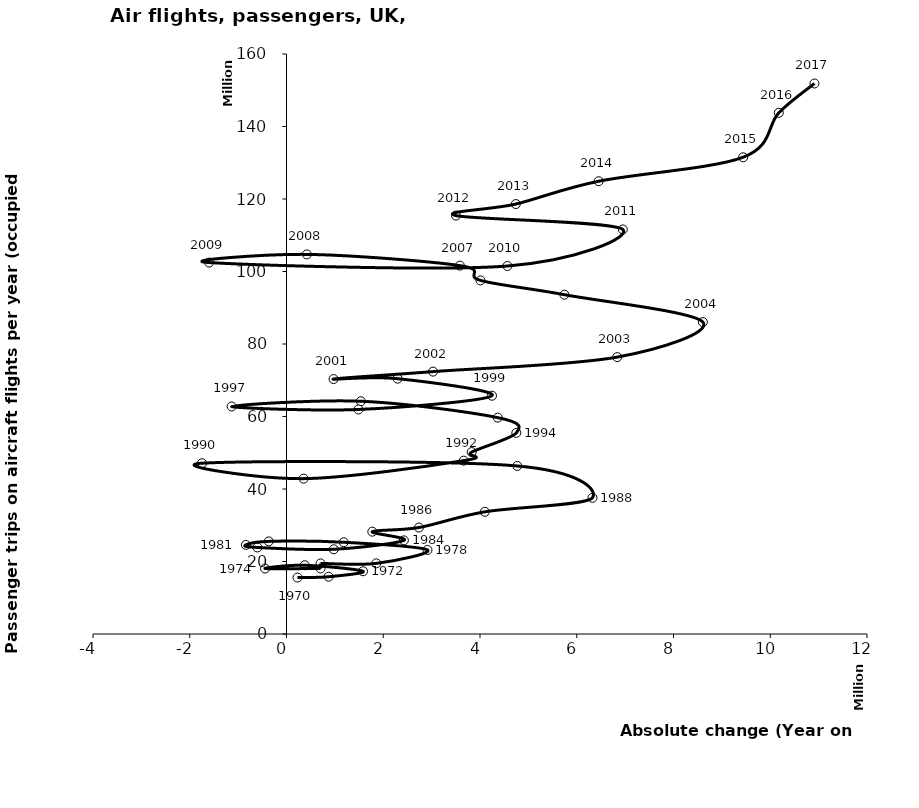
| Category | Series 0 |
|---|---|
| 227200.0 | 15568800 |
| 869850.0 | 15796000 |
| 1581850.0 | 17308500 |
| 377050.0 | 18959700 |
| -442400.0 | 18062600 |
| 705150.0 | 18074900 |
| 704800.0 | 19472900 |
| 1856600.0 | 19484500 |
| 2913800.0 | 23186100 |
| 1182550.0 | 25312100 |
| -366700.0 | 25551200 |
| -839350.0 | 24578700 |
| -601250.0 | 23872500 |
| 976600.0 | 23376200 |
| 2426600.0 | 25825700 |
| 1773700.0 | 28229400 |
| 2737950.0 | 29373100 |
| 4100000.0 | 33705300 |
| 6324550.0 | 37573100 |
| 4770250.0 | 46354400 |
| -1746600.0 | 47113600 |
| 352900.0 | 42861200 |
| 3663350.0 | 47819400 |
| 3828050.0 | 50187900 |
| 4750450.0 | 55475500 |
| 4366500.0 | 59688800 |
| 1537200.0 | 64208500 |
| -1134150.0 | 62763200 |
| 1487548.0 | 61940200 |
| 4247915.0 | 65738296 |
| 2296714.5 | 70436030 |
| 972583.0 | 70331725 |
| 3028467.5 | 72381196 |
| 6836783.0 | 76388660 |
| 8607109.5 | 86054762 |
| 5744934.5 | 93602879 |
| 4009964.0 | 97544631 |
| 3584461.0 | 101622807 |
| 420851.0 | 104713553 |
| -1598916.4033005014 | 102464509 |
| 4567018.570614502 | 101515720.193 |
| 6952100.186134003 | 111598546.141 |
| 3503659.929385498 | 115419920.566 |
| 4740877.743506998 | 118605866 |
| 6453564.0 | 124901676.053 |
| 9440018.9736595 | 131512994 |
| 10177141.0 | 143781714 |
| 10914263.0263405 | 151867276 |